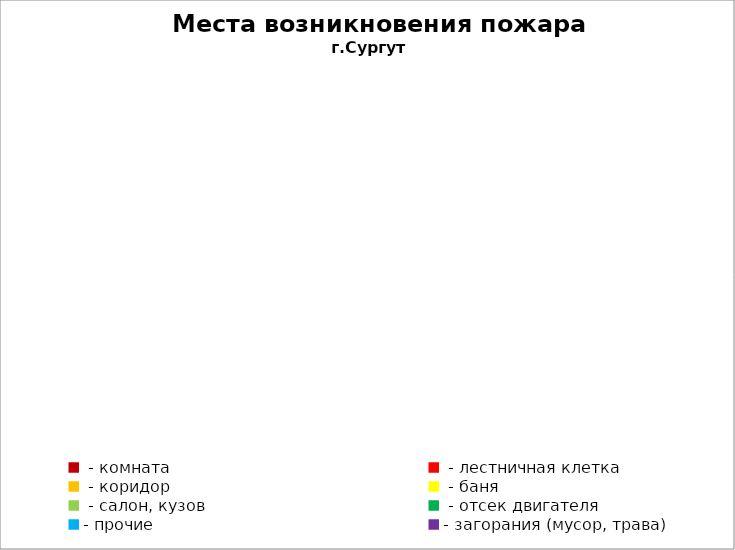
| Category | Места возникновения пожара |
|---|---|
|  - комната | 70 |
|  - лестничная клетка | 11 |
|  - коридор | 7 |
|  - баня | 38 |
|  - салон, кузов | 18 |
|  - отсек двигателя | 44 |
| - прочие | 120 |
| - загорания (мусор, трава)  | 41 |